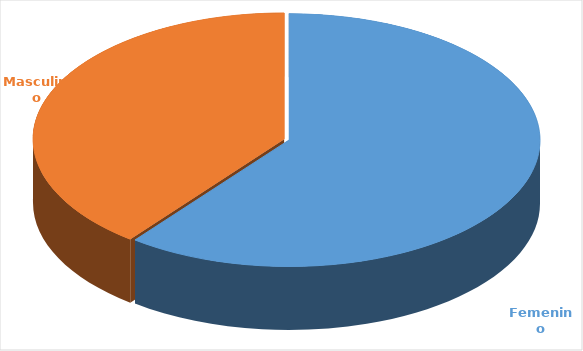
| Category | Cantidad  |
|---|---|
| Femenino | 3605 |
| Masculino | 2354 |